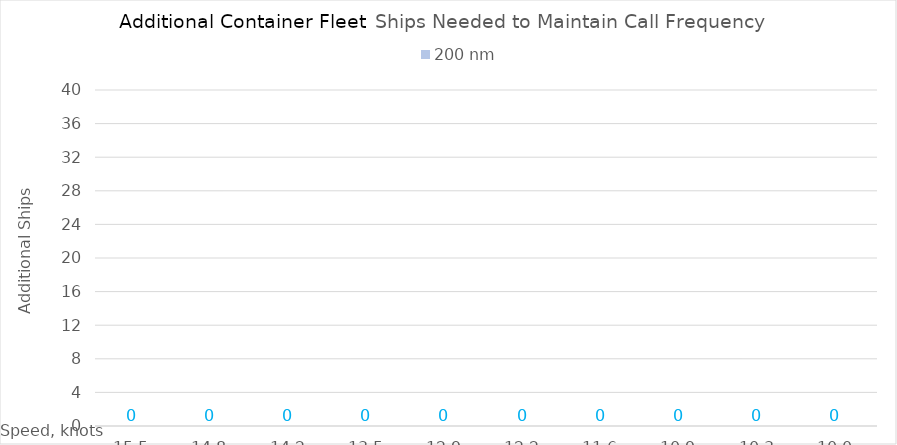
| Category | 200 |
|---|---|
| 15.450000000000001 | 0 |
| 14.8 | 0 |
| 14.15 | 0 |
| 13.5 | 0 |
| 12.85 | 0 |
| 12.2 | 0 |
| 11.549999999999999 | 0 |
| 10.899999999999999 | 0 |
| 10.249999999999998 | 0 |
| 10.0 | 0 |